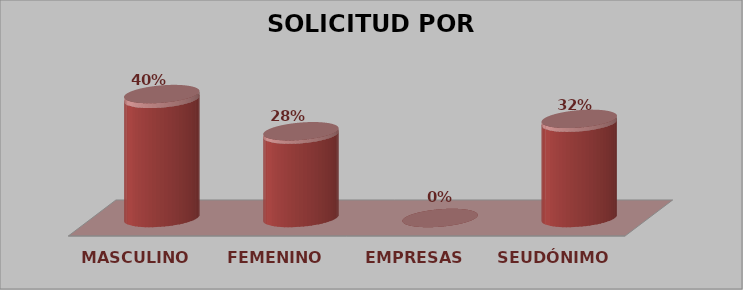
| Category | SOLICITUD POR GÉNERO | Series 1 |
|---|---|---|
| MASCULINO | 10 | 0.4 |
| FEMENINO | 7 | 0.28 |
| EMPRESAS | 0 | 0 |
| SEUDÓNIMO | 8 | 0.32 |